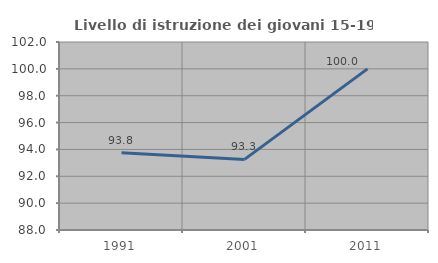
| Category | Livello di istruzione dei giovani 15-19 anni |
|---|---|
| 1991.0 | 93.75 |
| 2001.0 | 93.258 |
| 2011.0 | 100 |